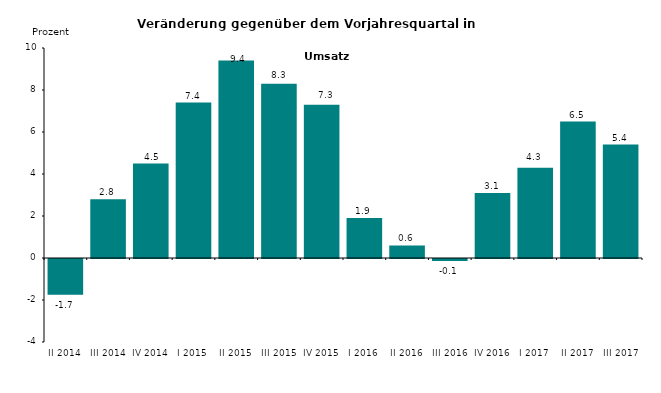
| Category | Series 0 |
|---|---|
| II 2014 | -1.7 |
| III 2014 | 2.8 |
| IV 2014 | 4.5 |
| I 2015 | 7.4 |
| II 2015 | 9.4 |
| III 2015 | 8.3 |
| IV 2015 | 7.3 |
| I 2016 | 1.9 |
| II 2016 | 0.6 |
| III 2016 | -0.1 |
| IV 2016 | 3.1 |
| I 2017 | 4.3 |
| II 2017 | 6.5 |
| III 2017 | 5.4 |